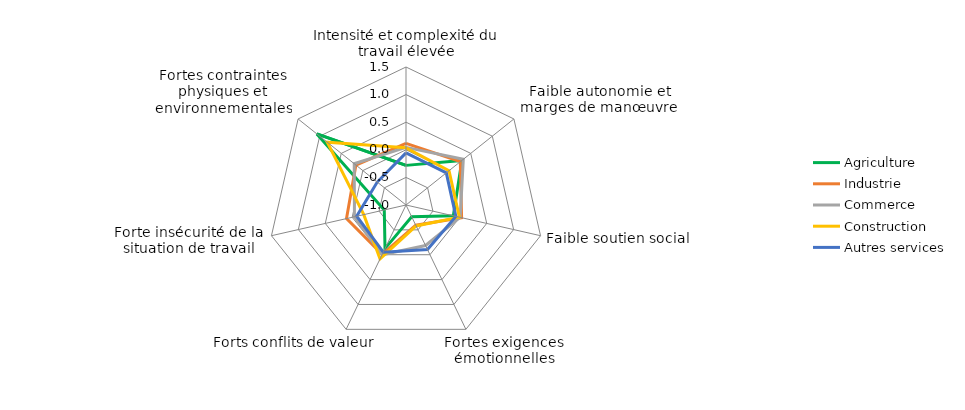
| Category | Agriculture | Industrie | Commerce | Construction | Autres services |
|---|---|---|---|---|---|
| Intensité et complexité du travail élevée | -0.282 | 0.116 | 0.043 | 0.036 | -0.055 |
| Faible autonomie et marges de manœuvre | 0.295 | 0.258 | 0.328 | -0.003 | -0.066 |
| Faible soutien social | -0.12 | 0.033 | 0.006 | -0.008 | -0.073 |
| Fortes exigences émotionnelles | -0.762 | -0.592 | -0.185 | -0.579 | -0.104 |
| Forts conflits de valeur | -0.124 | -0.007 | 0 | 0.085 | -0.051 |
| Forte insécurité de la situation de travail | -0.596 | 0.105 | -0.042 | -0.215 | -0.084 |
| Fortes contraintes physiques et environnementales | 1.065 | 0.161 | 0.199 | 0.824 | -0.334 |